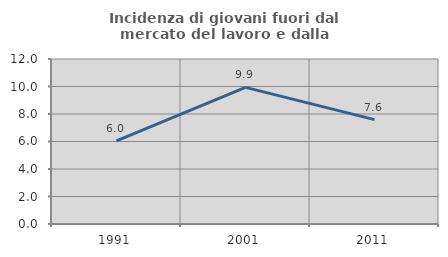
| Category | Incidenza di giovani fuori dal mercato del lavoro e dalla formazione  |
|---|---|
| 1991.0 | 6.038 |
| 2001.0 | 9.938 |
| 2011.0 | 7.592 |